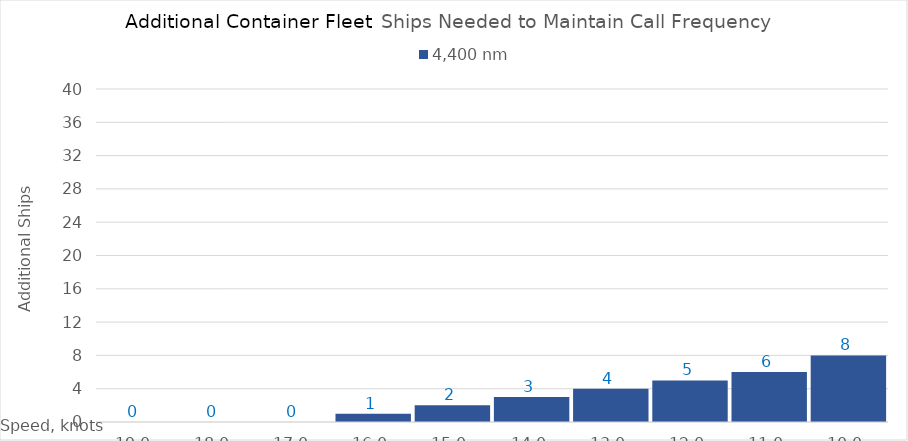
| Category | 4,400 |
|---|---|
| 19.0 | 0 |
| 18.0 | 0 |
| 17.0 | 0 |
| 16.0 | 1 |
| 15.0 | 2 |
| 14.0 | 3 |
| 13.0 | 4 |
| 12.0 | 5 |
| 11.0 | 6 |
| 10.0 | 8 |